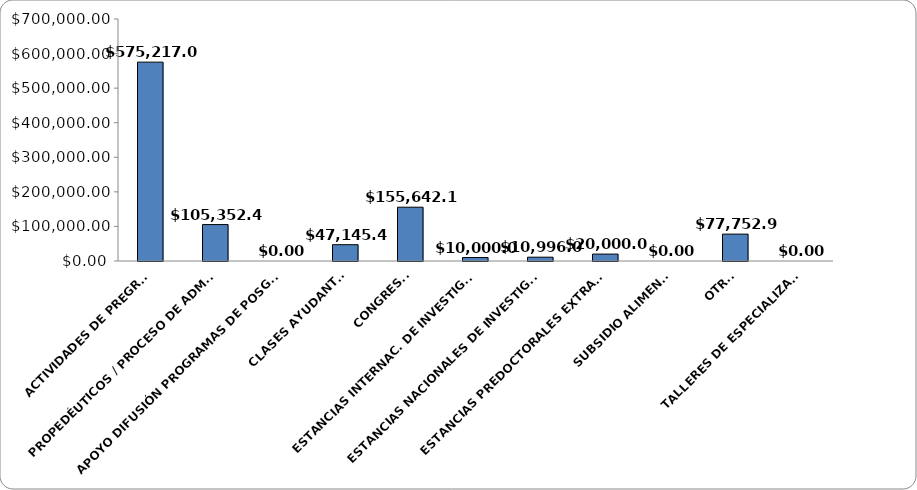
| Category | Series 0 |
|---|---|
| ACTIVIDADES DE PREGRADO | 575217 |
| PROPEDÉUTICOS / PROCESO DE ADMISIÓN | 105352.48 |
| APOYO DIFUSIÓN PROGRAMAS DE POSGRADO | 0 |
| CLASES AYUDANTÍAS | 47145.42 |
| CONGRESOS | 155642.13 |
| ESTANCIAS INTERNAC. DE INVESTIGACIÓN | 10000 |
| ESTANCIAS NACIONALES DE INVESTIGACIÓN | 10996.08 |
| ESTANCIAS PREDOCTORALES EXTRANJERO | 20000 |
| SUBSIDIO ALIMENTOS | 0 |
| OTROS | 77752.9 |
| TALLERES DE ESPECIALIZACIÓN | 0 |